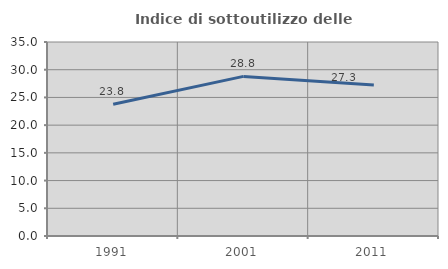
| Category | Indice di sottoutilizzo delle abitazioni  |
|---|---|
| 1991.0 | 23.754 |
| 2001.0 | 28.794 |
| 2011.0 | 27.257 |